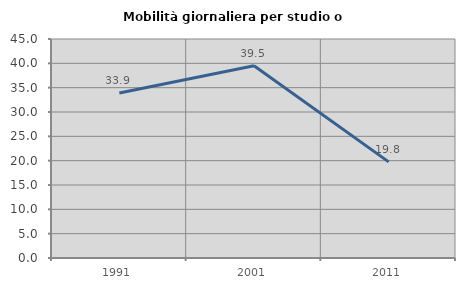
| Category | Mobilità giornaliera per studio o lavoro |
|---|---|
| 1991.0 | 33.886 |
| 2001.0 | 39.498 |
| 2011.0 | 19.751 |